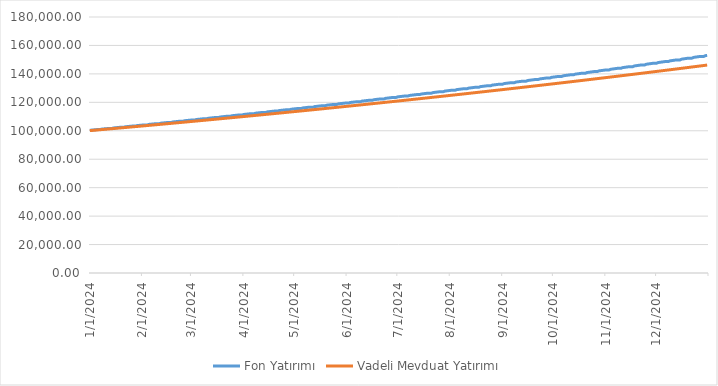
| Category | Fon Yatırımı | Vadeli Mevduat Yatırımı |
|---|---|---|
| 1/1/24 | 100348.316 | 100103.825 |
| 1/2/24 | 100464.097 | 100207.758 |
| 1/3/24 | 100580.012 | 100311.799 |
| 1/4/24 | 100696.061 | 100415.948 |
| 1/5/24 | 100812.244 | 100520.205 |
| 1/6/24 | 100812.244 | 100624.57 |
| 1/7/24 | 100812.244 | 100729.044 |
| 1/8/24 | 101163.389 | 100833.626 |
| 1/9/24 | 101280.111 | 100938.316 |
| 1/10/24 | 101396.968 | 101043.116 |
| 1/11/24 | 101513.959 | 101148.024 |
| 1/12/24 | 101631.086 | 101253.041 |
| 1/13/24 | 101631.086 | 101358.167 |
| 1/14/24 | 101631.086 | 101463.402 |
| 1/15/24 | 101985.083 | 101568.747 |
| 1/16/24 | 102102.753 | 101674.201 |
| 1/17/24 | 102220.559 | 101779.764 |
| 1/18/24 | 102338.501 | 101885.437 |
| 1/19/24 | 102456.579 | 101991.22 |
| 1/20/24 | 102456.579 | 102097.112 |
| 1/21/24 | 102456.579 | 102203.115 |
| 1/22/24 | 102813.451 | 102309.227 |
| 1/23/24 | 102932.077 | 102415.45 |
| 1/24/24 | 103050.84 | 102521.783 |
| 1/25/24 | 103169.739 | 102628.226 |
| 1/26/24 | 103288.776 | 102734.78 |
| 1/27/24 | 103288.776 | 102841.445 |
| 1/28/24 | 103288.776 | 102948.22 |
| 1/29/24 | 103648.547 | 103055.106 |
| 1/30/24 | 103768.137 | 103162.103 |
| 1/31/24 | 103887.864 | 103269.211 |
| 2/1/24 | 104007.73 | 103376.431 |
| 2/2/24 | 104127.734 | 103483.762 |
| 2/3/24 | 104127.734 | 103591.204 |
| 2/4/24 | 104127.734 | 103698.757 |
| 2/5/24 | 104490.427 | 103806.423 |
| 2/6/24 | 104610.988 | 103914.2 |
| 2/7/24 | 104731.687 | 104022.089 |
| 2/8/24 | 104852.527 | 104130.09 |
| 2/9/24 | 104973.505 | 104238.203 |
| 2/10/24 | 104973.505 | 104346.429 |
| 2/11/24 | 104973.505 | 104454.767 |
| 2/12/24 | 105339.144 | 104563.217 |
| 2/13/24 | 105460.684 | 104671.78 |
| 2/14/24 | 105582.365 | 104780.455 |
| 2/15/24 | 105704.185 | 104889.244 |
| 2/16/24 | 105826.146 | 104998.145 |
| 2/17/24 | 105826.146 | 105107.16 |
| 2/18/24 | 105826.146 | 105216.287 |
| 2/19/24 | 106194.755 | 105325.528 |
| 2/20/24 | 106317.283 | 105434.883 |
| 2/21/24 | 106439.951 | 105544.351 |
| 2/22/24 | 106562.761 | 105653.932 |
| 2/23/24 | 106685.713 | 105763.627 |
| 2/24/24 | 106685.713 | 105873.437 |
| 2/25/24 | 106685.713 | 105983.36 |
| 2/26/24 | 107057.316 | 106093.397 |
| 2/27/24 | 107180.839 | 106203.549 |
| 2/28/24 | 107304.504 | 106313.815 |
| 2/29/24 | 107428.311 | 106424.195 |
| 3/1/24 | 107552.262 | 106534.69 |
| 3/2/24 | 107552.262 | 106645.3 |
| 3/3/24 | 107552.262 | 106756.025 |
| 3/4/24 | 107926.883 | 106866.864 |
| 3/5/24 | 108051.409 | 106977.819 |
| 3/6/24 | 108176.078 | 107088.889 |
| 3/7/24 | 108300.892 | 107200.074 |
| 3/8/24 | 108425.849 | 107311.375 |
| 3/9/24 | 108425.849 | 107422.791 |
| 3/10/24 | 108425.849 | 107534.323 |
| 3/11/24 | 108803.513 | 107645.971 |
| 3/12/24 | 108929.05 | 107757.734 |
| 3/13/24 | 109054.732 | 107869.614 |
| 3/14/24 | 109180.56 | 107981.609 |
| 3/15/24 | 109306.532 | 108093.722 |
| 3/16/24 | 109306.532 | 108205.95 |
| 3/17/24 | 109306.532 | 108318.295 |
| 3/18/24 | 109687.264 | 108430.757 |
| 3/19/24 | 109813.82 | 108543.335 |
| 3/20/24 | 109940.523 | 108656.03 |
| 3/21/24 | 110067.372 | 108768.842 |
| 3/22/24 | 110194.368 | 108881.772 |
| 3/23/24 | 110194.368 | 108994.819 |
| 3/24/24 | 110194.368 | 109107.983 |
| 3/25/24 | 110578.192 | 109221.264 |
| 3/26/24 | 110705.777 | 109334.663 |
| 3/27/24 | 110833.509 | 109448.18 |
| 3/28/24 | 110961.388 | 109561.815 |
| 3/29/24 | 111089.415 | 109675.567 |
| 3/30/24 | 111089.415 | 109789.438 |
| 3/31/24 | 111089.415 | 109903.427 |
| 4/1/24 | 111476.357 | 110017.535 |
| 4/2/24 | 111604.978 | 110131.761 |
| 4/3/24 | 111733.748 | 110246.105 |
| 4/4/24 | 111862.666 | 110360.568 |
| 4/5/24 | 111991.733 | 110475.15 |
| 4/6/24 | 111991.733 | 110589.851 |
| 4/7/24 | 111991.733 | 110704.671 |
| 4/8/24 | 112381.817 | 110819.611 |
| 4/9/24 | 112511.483 | 110934.669 |
| 4/10/24 | 112641.299 | 111049.847 |
| 4/11/24 | 112771.264 | 111165.145 |
| 4/12/24 | 112901.379 | 111280.562 |
| 4/13/24 | 112901.379 | 111396.099 |
| 4/14/24 | 112901.379 | 111511.757 |
| 4/15/24 | 113294.632 | 111627.534 |
| 4/16/24 | 113425.351 | 111743.431 |
| 4/17/24 | 113556.221 | 111859.449 |
| 4/18/24 | 113687.242 | 111975.587 |
| 4/19/24 | 113818.414 | 112091.846 |
| 4/20/24 | 113818.414 | 112208.226 |
| 4/21/24 | 113818.414 | 112324.726 |
| 4/22/24 | 114214.862 | 112441.347 |
| 4/23/24 | 114346.642 | 112558.09 |
| 4/24/24 | 114478.575 | 112674.953 |
| 4/25/24 | 114610.66 | 112791.938 |
| 4/26/24 | 114742.898 | 112909.044 |
| 4/27/24 | 114742.898 | 113026.272 |
| 4/28/24 | 114742.898 | 113143.622 |
| 4/29/24 | 115142.565 | 113261.094 |
| 4/30/24 | 115275.416 | 113378.687 |
| 5/1/24 | 115408.421 | 113496.403 |
| 5/2/24 | 115541.579 | 113614.241 |
| 5/3/24 | 115674.89 | 113732.201 |
| 5/4/24 | 115674.89 | 113850.283 |
| 5/5/24 | 115674.89 | 113968.488 |
| 5/6/24 | 116077.804 | 114086.816 |
| 5/7/24 | 116211.734 | 114205.267 |
| 5/8/24 | 116345.819 | 114323.841 |
| 5/9/24 | 116480.059 | 114442.538 |
| 5/10/24 | 116614.453 | 114561.358 |
| 5/11/24 | 116614.453 | 114680.301 |
| 5/12/24 | 116614.453 | 114799.368 |
| 5/13/24 | 117020.64 | 114918.559 |
| 5/14/24 | 117155.658 | 115037.873 |
| 5/15/24 | 117290.832 | 115157.312 |
| 5/16/24 | 117426.161 | 115276.874 |
| 5/17/24 | 117561.647 | 115396.56 |
| 5/18/24 | 117561.647 | 115516.371 |
| 5/19/24 | 117561.647 | 115636.306 |
| 5/20/24 | 117971.133 | 115756.365 |
| 5/21/24 | 118107.248 | 115876.55 |
| 5/22/24 | 118243.52 | 115996.859 |
| 5/23/24 | 118379.949 | 116117.293 |
| 5/24/24 | 118516.535 | 116237.851 |
| 5/25/24 | 118516.535 | 116358.536 |
| 5/26/24 | 118516.535 | 116479.345 |
| 5/27/24 | 118929.347 | 116600.28 |
| 5/28/24 | 119066.567 | 116721.34 |
| 5/29/24 | 119203.946 | 116842.526 |
| 5/30/24 | 119341.483 | 116963.838 |
| 5/31/24 | 119479.179 | 117085.276 |
| 6/1/24 | 119479.179 | 117206.84 |
| 6/2/24 | 119479.179 | 117328.53 |
| 6/3/24 | 119895.344 | 117450.347 |
| 6/4/24 | 120033.679 | 117572.29 |
| 6/5/24 | 120172.173 | 117694.359 |
| 6/6/24 | 120310.827 | 117816.556 |
| 6/7/24 | 120449.642 | 117938.879 |
| 6/8/24 | 120449.642 | 118061.329 |
| 6/9/24 | 120449.642 | 118183.906 |
| 6/10/24 | 120869.187 | 118306.611 |
| 6/11/24 | 121008.645 | 118429.443 |
| 6/12/24 | 121148.265 | 118552.402 |
| 6/13/24 | 121288.045 | 118675.49 |
| 6/14/24 | 121427.987 | 118798.705 |
| 6/15/24 | 121427.987 | 118922.048 |
| 6/16/24 | 121427.987 | 119045.519 |
| 6/17/24 | 121850.94 | 119169.118 |
| 6/18/24 | 121991.531 | 119292.845 |
| 6/19/24 | 122132.285 | 119416.701 |
| 6/20/24 | 122273.201 | 119540.686 |
| 6/21/24 | 122414.279 | 119664.799 |
| 6/22/24 | 122414.279 | 119789.041 |
| 6/23/24 | 122414.279 | 119913.412 |
| 6/24/24 | 122840.667 | 120037.913 |
| 6/25/24 | 122982.4 | 120162.542 |
| 6/26/24 | 123124.297 | 120287.301 |
| 6/27/24 | 123266.358 | 120412.189 |
| 6/28/24 | 123408.582 | 120537.208 |
| 6/29/24 | 123408.582 | 120662.356 |
| 6/30/24 | 123408.582 | 120787.633 |
| 7/1/24 | 123838.433 | 120913.041 |
| 7/2/24 | 123981.318 | 121038.579 |
| 7/3/24 | 124124.367 | 121164.248 |
| 7/4/24 | 124267.582 | 121290.047 |
| 7/5/24 | 124410.961 | 121415.976 |
| 7/6/24 | 124410.961 | 121542.037 |
| 7/7/24 | 124410.961 | 121668.228 |
| 7/8/24 | 124844.304 | 121794.55 |
| 7/9/24 | 124988.349 | 121921.003 |
| 7/10/24 | 125132.56 | 122047.588 |
| 7/11/24 | 125276.938 | 122174.304 |
| 7/12/24 | 125421.482 | 122301.152 |
| 7/13/24 | 125421.482 | 122428.131 |
| 7/14/24 | 125421.482 | 122555.242 |
| 7/15/24 | 125858.345 | 122682.485 |
| 7/16/24 | 126003.56 | 122809.861 |
| 7/17/24 | 126148.942 | 122937.368 |
| 7/18/24 | 126294.493 | 123065.008 |
| 7/19/24 | 126440.211 | 123192.781 |
| 7/20/24 | 126440.211 | 123320.686 |
| 7/21/24 | 126440.211 | 123448.723 |
| 7/22/24 | 126880.622 | 123576.894 |
| 7/23/24 | 127027.016 | 123705.198 |
| 7/24/24 | 127173.58 | 123833.635 |
| 7/25/24 | 127320.312 | 123962.206 |
| 7/26/24 | 127467.214 | 124090.91 |
| 7/27/24 | 127467.214 | 124219.747 |
| 7/28/24 | 127467.214 | 124348.719 |
| 7/29/24 | 127911.203 | 124477.824 |
| 7/30/24 | 128058.786 | 124607.063 |
| 7/31/24 | 128206.54 | 124736.436 |
| 8/1/24 | 128354.464 | 124865.944 |
| 8/2/24 | 128502.559 | 124995.586 |
| 8/3/24 | 128502.559 | 125125.363 |
| 8/4/24 | 128502.559 | 125255.275 |
| 8/5/24 | 128950.154 | 125385.321 |
| 8/6/24 | 129098.936 | 125515.503 |
| 8/7/24 | 129247.89 | 125645.819 |
| 8/8/24 | 129397.016 | 125776.271 |
| 8/9/24 | 129546.314 | 125906.859 |
| 8/10/24 | 129546.314 | 126037.582 |
| 8/11/24 | 129546.314 | 126168.44 |
| 8/12/24 | 129997.544 | 126299.435 |
| 8/13/24 | 130147.535 | 126430.566 |
| 8/14/24 | 130297.699 | 126561.832 |
| 8/15/24 | 130448.036 | 126693.235 |
| 8/16/24 | 130598.547 | 126824.775 |
| 8/17/24 | 130598.547 | 126956.451 |
| 8/18/24 | 130598.547 | 127088.263 |
| 8/19/24 | 131053.442 | 127220.213 |
| 8/20/24 | 131204.651 | 127352.3 |
| 8/21/24 | 131356.035 | 127484.523 |
| 8/22/24 | 131507.593 | 127616.884 |
| 8/23/24 | 131659.326 | 127749.383 |
| 8/24/24 | 131659.326 | 127882.019 |
| 8/25/24 | 131659.326 | 128014.792 |
| 8/26/24 | 132117.916 | 128147.704 |
| 8/27/24 | 132270.353 | 128280.753 |
| 8/28/24 | 132422.967 | 128413.941 |
| 8/29/24 | 132575.756 | 128547.267 |
| 8/30/24 | 132728.721 | 128680.731 |
| 8/31/24 | 132728.721 | 128814.334 |
| 9/1/24 | 132728.721 | 128948.076 |
| 9/2/24 | 133191.036 | 129081.956 |
| 9/3/24 | 133344.712 | 129215.976 |
| 9/4/24 | 133498.564 | 129350.135 |
| 9/5/24 | 133652.595 | 129484.433 |
| 9/6/24 | 133806.803 | 129618.87 |
| 9/7/24 | 133806.803 | 129753.447 |
| 9/8/24 | 133806.803 | 129888.164 |
| 9/9/24 | 134272.873 | 130023.02 |
| 9/10/24 | 134427.797 | 130158.017 |
| 9/11/24 | 134582.899 | 130293.154 |
| 9/12/24 | 134738.18 | 130428.431 |
| 9/13/24 | 134893.641 | 130563.848 |
| 9/14/24 | 134893.641 | 130699.406 |
| 9/15/24 | 134893.641 | 130835.105 |
| 9/16/24 | 135363.497 | 130970.945 |
| 9/17/24 | 135519.679 | 131106.925 |
| 9/18/24 | 135676.041 | 131243.047 |
| 9/19/24 | 135832.584 | 131379.311 |
| 9/20/24 | 135989.307 | 131515.715 |
| 9/21/24 | 135989.307 | 131652.262 |
| 9/22/24 | 135989.307 | 131788.95 |
| 9/23/24 | 136462.979 | 131925.78 |
| 9/24/24 | 136620.429 | 132062.752 |
| 9/25/24 | 136778.062 | 132199.866 |
| 9/26/24 | 136935.876 | 132337.123 |
| 9/27/24 | 137093.872 | 132474.522 |
| 9/28/24 | 137093.872 | 132612.064 |
| 9/29/24 | 137093.872 | 132749.749 |
| 9/30/24 | 137571.392 | 132887.576 |
| 10/1/24 | 137730.121 | 133025.547 |
| 10/2/24 | 137889.034 | 133163.661 |
| 10/3/24 | 138048.13 | 133301.918 |
| 10/4/24 | 138207.409 | 133440.319 |
| 10/5/24 | 138207.409 | 133578.864 |
| 10/6/24 | 138207.409 | 133717.552 |
| 10/7/24 | 138688.807 | 133856.385 |
| 10/8/24 | 138848.826 | 133995.361 |
| 10/9/24 | 139009.03 | 134134.482 |
| 10/10/24 | 139169.418 | 134273.748 |
| 10/11/24 | 139329.991 | 134413.158 |
| 10/12/24 | 139329.991 | 134552.712 |
| 10/13/24 | 139329.991 | 134692.412 |
| 10/14/24 | 139815.299 | 134832.256 |
| 10/15/24 | 139976.618 | 134972.246 |
| 10/16/24 | 140138.122 | 135112.381 |
| 10/17/24 | 140299.814 | 135252.662 |
| 10/18/24 | 140461.691 | 135393.088 |
| 10/19/24 | 140461.691 | 135533.66 |
| 10/20/24 | 140461.691 | 135674.378 |
| 10/21/24 | 140950.941 | 135815.242 |
| 10/22/24 | 141113.57 | 135956.253 |
| 10/23/24 | 141276.386 | 136097.409 |
| 10/24/24 | 141439.391 | 136238.713 |
| 10/25/24 | 141602.583 | 136380.163 |
| 10/26/24 | 141602.583 | 136521.76 |
| 10/27/24 | 141602.583 | 136663.503 |
| 10/28/24 | 142095.807 | 136805.395 |
| 10/29/24 | 142259.757 | 136947.433 |
| 10/30/24 | 142423.896 | 137089.619 |
| 10/31/24 | 142588.224 | 137231.952 |
| 11/1/24 | 142752.742 | 137374.434 |
| 11/2/24 | 142752.742 | 137517.063 |
| 11/3/24 | 142752.742 | 137659.84 |
| 11/4/24 | 143249.972 | 137802.766 |
| 11/5/24 | 143415.254 | 137945.839 |
| 11/6/24 | 143580.726 | 138089.062 |
| 11/7/24 | 143746.389 | 138232.433 |
| 11/8/24 | 143912.243 | 138375.953 |
| 11/9/24 | 143912.243 | 138519.622 |
| 11/10/24 | 143912.243 | 138663.44 |
| 11/11/24 | 144413.512 | 138807.408 |
| 11/12/24 | 144580.136 | 138951.525 |
| 11/13/24 | 144746.952 | 139095.791 |
| 11/14/24 | 144913.961 | 139240.208 |
| 11/15/24 | 145081.162 | 139384.774 |
| 11/16/24 | 145081.162 | 139529.491 |
| 11/17/24 | 145081.162 | 139674.357 |
| 11/18/24 | 145586.502 | 139819.374 |
| 11/19/24 | 145754.48 | 139964.542 |
| 11/20/24 | 145922.651 | 140109.86 |
| 11/21/24 | 146091.016 | 140255.33 |
| 11/22/24 | 146259.575 | 140400.95 |
| 11/23/24 | 146259.575 | 140546.721 |
| 11/24/24 | 146259.575 | 140692.644 |
| 11/25/24 | 146769.02 | 140838.719 |
| 11/26/24 | 146938.362 | 140984.945 |
| 11/27/24 | 147107.899 | 141131.322 |
| 11/28/24 | 147277.632 | 141277.852 |
| 11/29/24 | 147447.561 | 141424.534 |
| 11/30/24 | 147447.561 | 141571.368 |
| 12/1/24 | 147447.561 | 141718.355 |
| 12/2/24 | 147961.143 | 141865.494 |
| 12/3/24 | 148131.861 | 142012.786 |
| 12/4/24 | 148302.775 | 142160.231 |
| 12/5/24 | 148473.886 | 142307.829 |
| 12/6/24 | 148645.195 | 142455.581 |
| 12/7/24 | 148645.195 | 142603.485 |
| 12/8/24 | 148645.195 | 142751.544 |
| 12/9/24 | 149162.949 | 142899.756 |
| 12/10/24 | 149335.053 | 143048.121 |
| 12/11/24 | 149507.356 | 143196.641 |
| 12/12/24 | 149679.857 | 143345.315 |
| 12/13/24 | 149852.557 | 143494.144 |
| 12/14/24 | 149852.557 | 143643.127 |
| 12/15/24 | 149852.557 | 143792.265 |
| 12/16/24 | 150374.517 | 143941.557 |
| 12/17/24 | 150548.019 | 144091.005 |
| 12/18/24 | 150721.721 | 144240.607 |
| 12/19/24 | 150895.623 | 144390.365 |
| 12/20/24 | 151069.726 | 144540.279 |
| 12/21/24 | 151069.726 | 144690.348 |
| 12/22/24 | 151069.726 | 144840.573 |
| 12/23/24 | 151595.925 | 144990.954 |
| 12/24/24 | 151770.836 | 145141.491 |
| 12/25/24 | 151945.949 | 145292.184 |
| 12/26/24 | 152121.264 | 145443.034 |
| 12/27/24 | 152296.781 | 145594.04 |
| 12/28/24 | 152296.781 | 145745.204 |
| 12/29/24 | 152296.781 | 145896.524 |
| 12/30/24 | 152827.255 | 146048.001 |
| 12/31/24 | 153003.586 | 146199.636 |